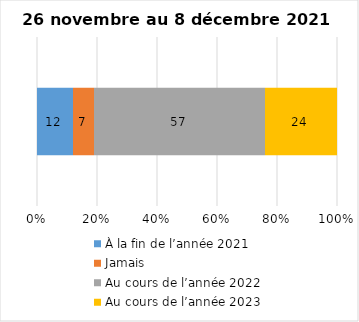
| Category | À la fin de l’année 2021 | Jamais | Au cours de l’année 2022 | Au cours de l’année 2023 |
|---|---|---|---|---|
| 0 | 12 | 7 | 57 | 24 |